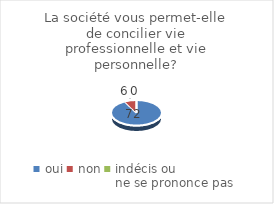
| Category | La société vous permet-elle de concilier vie professionnelle et vie personnelle? |
|---|---|
| oui | 72 |
| non | 6 |
| indécis ou 
ne se prononce pas | 0 |